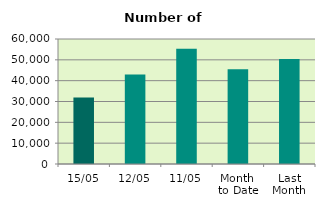
| Category | Series 0 |
|---|---|
| 15/05 | 31862 |
| 12/05 | 42940 |
| 11/05 | 55358 |
| Month 
to Date | 45456.6 |
| Last
Month | 50445.556 |